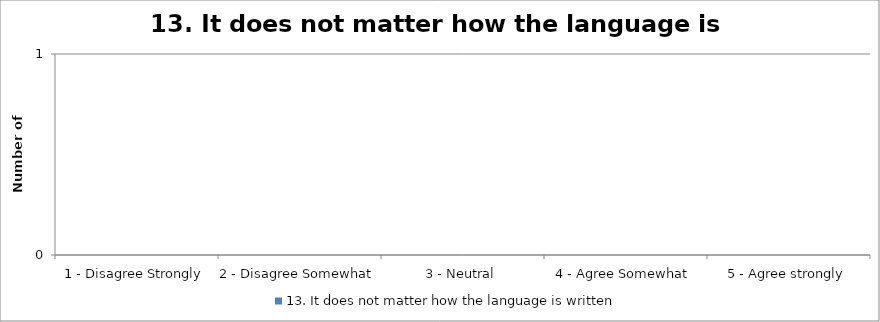
| Category | 13. It does not matter how the language is written |
|---|---|
| 1 - Disagree Strongly | 0 |
| 2 - Disagree Somewhat | 0 |
| 3 - Neutral | 0 |
| 4 - Agree Somewhat | 0 |
| 5 - Agree strongly | 0 |